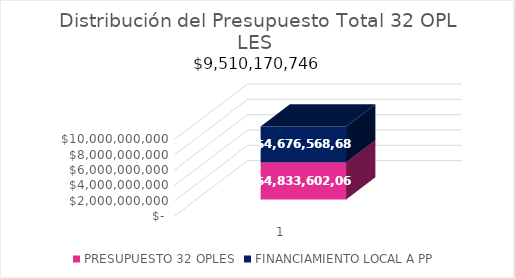
| Category | PRESUPUESTO 32 OPLES | FINANCIAMIENTO LOCAL A PP  |
|---|---|---|
| 0 | 4833602064.44 | 4676568681.97 |